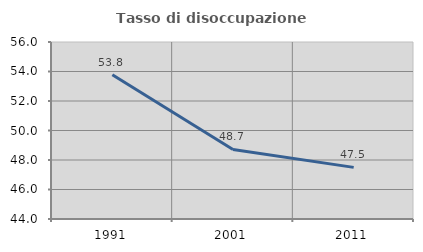
| Category | Tasso di disoccupazione giovanile  |
|---|---|
| 1991.0 | 53.782 |
| 2001.0 | 48.718 |
| 2011.0 | 47.5 |